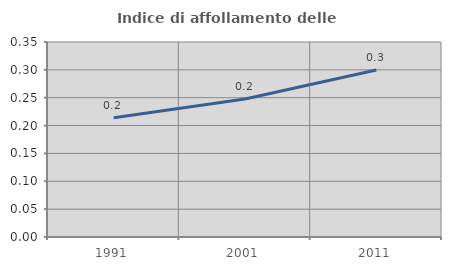
| Category | Indice di affollamento delle abitazioni  |
|---|---|
| 1991.0 | 0.214 |
| 2001.0 | 0.248 |
| 2011.0 | 0.3 |